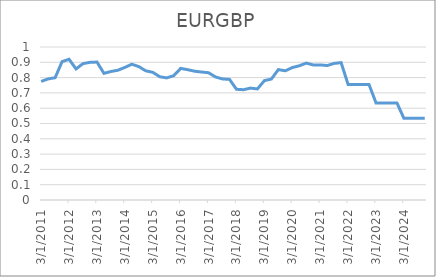
| Category | EURGBP | GDP |
|---|---|---|
| 3/31/11 | 0.775 |  |
| 6/30/11 | 0.791 |  |
| 9/30/11 | 0.799 |  |
| 12/31/11 | 0.904 |  |
| 3/31/12 | 0.92 |  |
| 6/30/12 | 0.857 |  |
| 9/30/12 | 0.891 |  |
| 12/31/12 | 0.9 |  |
| 3/31/13 | 0.902 |  |
| 6/30/13 | 0.828 |  |
| 9/30/13 | 0.84 |  |
| 12/31/13 | 0.848 |  |
| 3/31/14 | 0.867 |  |
| 6/30/14 | 0.887 |  |
| 9/30/14 | 0.872 |  |
| 12/31/14 | 0.844 |  |
| 3/31/15 | 0.835 |  |
| 6/30/15 | 0.806 |  |
| 9/30/15 | 0.798 |  |
| 12/31/15 | 0.812 |  |
| 3/31/16 | 0.86 |  |
| 6/30/16 | 0.852 |  |
| 9/30/16 | 0.842 |  |
| 12/31/16 | 0.836 |  |
| 3/31/17 | 0.832 |  |
| 6/30/17 | 0.804 |  |
| 9/30/17 | 0.791 |  |
| 12/31/17 | 0.788 |  |
| 3/31/18 | 0.724 |  |
| 6/30/18 | 0.721 |  |
| 9/30/18 | 0.731 |  |
| 12/31/18 | 0.726 |  |
| 3/31/19 | 0.78 |  |
| 6/30/19 | 0.79 |  |
| 9/30/19 | 0.852 |  |
| 12/31/19 | 0.844 |  |
| 3/31/20 | 0.866 |  |
| 6/30/20 | 0.877 |  |
| 9/30/20 | 0.895 |  |
| 12/31/20 | 0.883 |  |
| 3/31/21 | 0.883 |  |
| 6/30/21 | 0.879 |  |
| 9/30/21 | 0.893 |  |
| 12/31/21 | 0.898 |  |
| 3/31/22 | 0.755 |  |
| 6/30/22 | 0.755 |  |
| 9/30/22 | 0.755 |  |
| 12/31/22 | 0.755 |  |
| 3/31/23 | 0.635 |  |
| 6/30/23 | 0.635 |  |
| 9/30/23 | 0.635 |  |
| 12/31/23 | 0.635 |  |
| 3/31/24 | 0.534 |  |
| 6/30/24 | 0.534 |  |
| 9/30/24 | 0.534 |  |
| 12/31/24 | 0.534 |  |